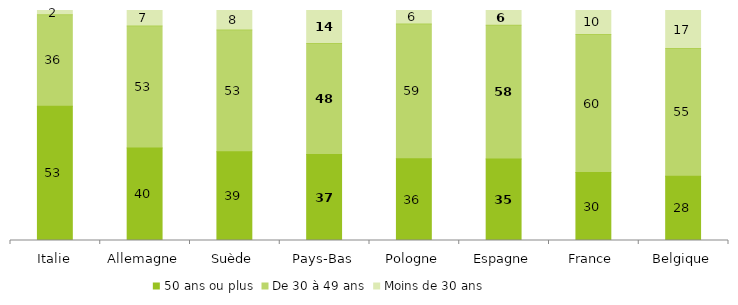
| Category | 50 ans ou plus | De 30 à 49 ans | Moins de 30 ans |
|---|---|---|---|
| Italie | 53.33 | 36.285 | 1.699 |
| Allemagne | 40.08 | 52.753 | 6.725 |
| Suède | 38.612 | 52.956 | 8.432 |
| Pays-Bas | 37.368 | 48.334 | 14.297 |
| Pologne | 35.593 | 58.592 | 5.815 |
| Espagne | 35.458 | 58.075 | 6.467 |
| France | 29.532 | 60.048 | 10.42 |
| Belgique | 27.97 | 55.494 | 16.536 |